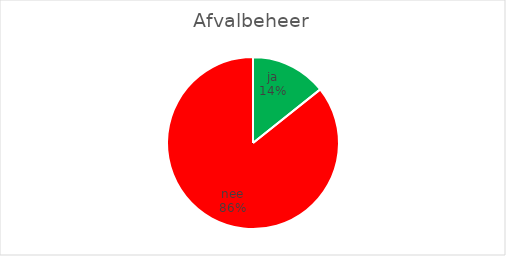
| Category | Afvalbeheer |
|---|---|
| ja | 1 |
| nee | 6 |